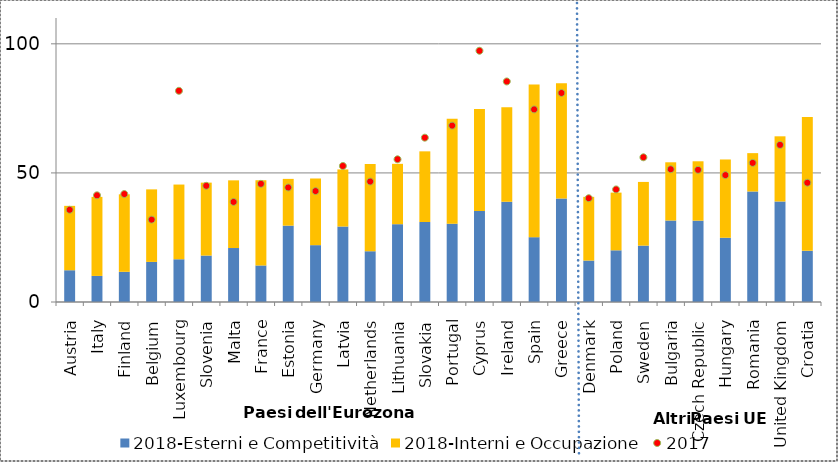
| Category | 2018-Esterni e Competitività | 2018-Interni e Occupazione |
|---|---|---|
| Austria | 12.302 | 24.938 |
| Italy | 10.102 | 30.61 |
| Finland | 11.694 | 30.015 |
| Belgium | 15.532 | 28.09 |
| Luxembourg | 16.556 | 28.937 |
| Slovenia | 17.984 | 28.253 |
| Malta | 20.905 | 26.213 |
| France | 14.156 | 33.006 |
| Estonia | 29.574 | 18.112 |
| Germany | 22.016 | 25.82 |
| Latvia | 29.238 | 22.109 |
| Netherlands | 19.667 | 33.819 |
| Lithuania | 30.136 | 23.38 |
| Slovakia | 30.977 | 27.374 |
| Portugal | 30.329 | 40.613 |
| Cyprus | 35.224 | 39.521 |
| Ireland | 38.816 | 36.647 |
| Spain | 25.107 | 59.16 |
| Greece | 40.07 | 44.668 |
| Denmark | 16.056 | 24.674 |
| Poland | 20.023 | 22.347 |
| Sweden | 21.841 | 24.666 |
| Bulgaria | 31.565 | 22.547 |
| Czech Republic | 31.51 | 22.99 |
| Hungary | 24.882 | 30.32 |
| Romania | 42.81 | 14.846 |
| United Kingdom | 38.94 | 25.234 |
| Croatia | 19.816 | 51.803 |